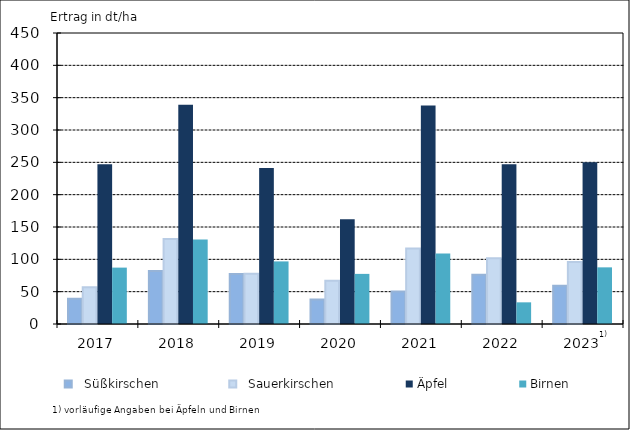
| Category |   Süßkirschen |   Sauerkirschen | Äpfel | Birnen |
|---|---|---|---|---|
| 2017.0 | 39.1 | 56.7 | 246.9 | 87.2 |
| 2018.0 | 81.9 | 131.6 | 339.1 | 130.7 |
| 2019.0 | 77.2 | 77.7 | 241.3 | 96.8 |
| 2020.0 | 38 | 66.9 | 161.9 | 77.5 |
| 2021.0 | 50.2 | 116.8 | 337.8 | 108.9 |
| 2022.0 | 76.3 | 101.7 | 247.2 | 33.5 |
| 2023.0 | 59.2 | 96 | 250 | 87.6 |